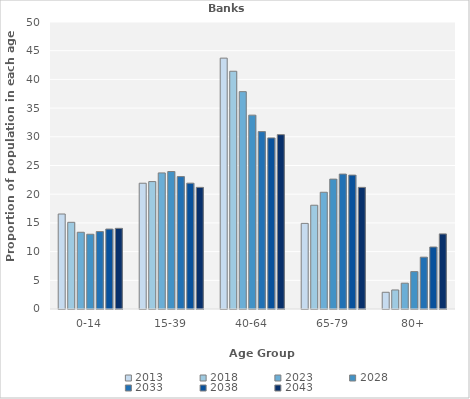
| Category | 2013 | 2018 | 2023 | 2028 | 2033 | 2038 | 2043 |
|---|---|---|---|---|---|---|---|
| 0-14 | 16.55 | 15.103 | 13.371 | 13.024 | 13.493 | 13.931 | 14.054 |
| 15-39 | 21.911 | 22.197 | 23.708 | 23.951 | 23.069 | 21.922 | 21.189 |
| 40-64 | 43.706 | 41.419 | 37.865 | 33.775 | 30.903 | 29.806 | 30.378 |
| 65-79 | 14.918 | 18.078 | 20.337 | 22.627 | 23.504 | 23.326 | 21.189 |
| 80+ | 2.914 | 3.318 | 4.494 | 6.512 | 9.032 | 10.799 | 13.081 |